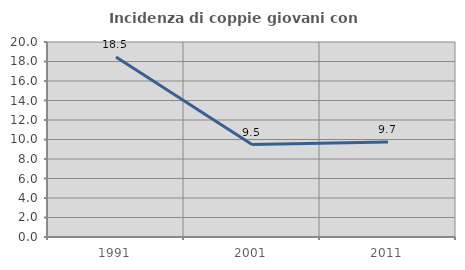
| Category | Incidenza di coppie giovani con figli |
|---|---|
| 1991.0 | 18.456 |
| 2001.0 | 9.477 |
| 2011.0 | 9.732 |